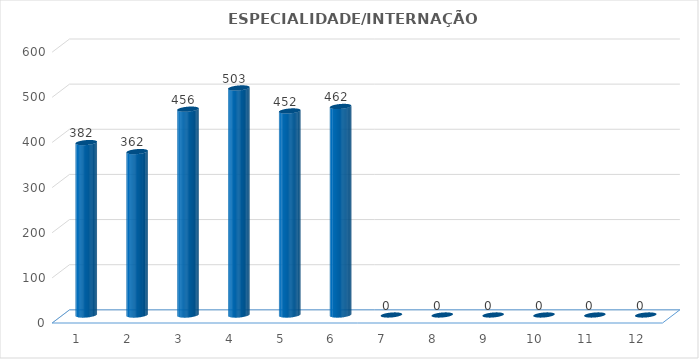
| Category | Series 0 |
|---|---|
| 0 | 382 |
| 1 | 362 |
| 2 | 456 |
| 3 | 503 |
| 4 | 452 |
| 5 | 462 |
| 6 | 0 |
| 7 | 0 |
| 8 | 0 |
| 9 | 0 |
| 10 | 0 |
| 11 | 0 |